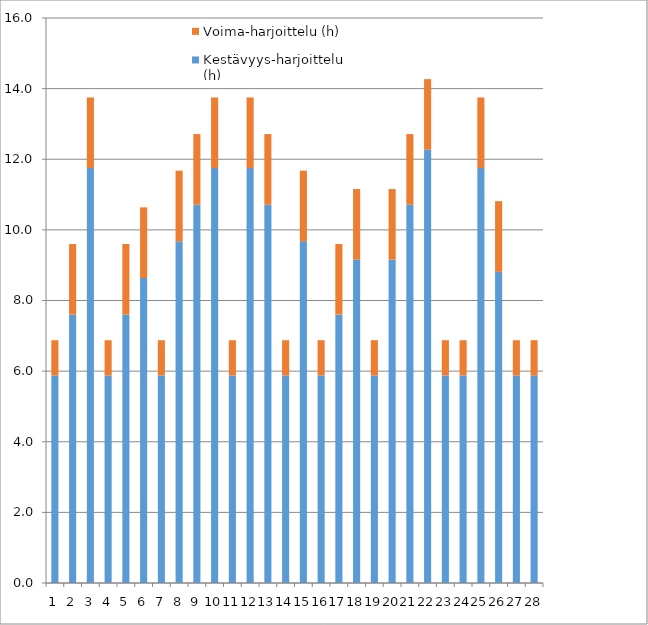
| Category | Kestävyys-harjoittelu (h) | Voima-harjoittelu (h) |
|---|---|---|
| 0 | 5.875 | 1 |
| 1 | 7.6 | 2 |
| 2 | 11.75 | 2 |
| 3 | 5.875 | 1 |
| 4 | 7.6 | 2 |
| 5 | 8.638 | 2 |
| 6 | 5.875 | 1 |
| 7 | 9.675 | 2 |
| 8 | 10.712 | 2 |
| 9 | 11.75 | 2 |
| 10 | 5.875 | 1 |
| 11 | 11.75 | 2 |
| 12 | 10.712 | 2 |
| 13 | 5.875 | 1 |
| 14 | 9.675 | 2 |
| 15 | 5.875 | 1 |
| 16 | 7.6 | 2 |
| 17 | 9.156 | 2 |
| 18 | 5.875 | 1 |
| 19 | 9.156 | 2 |
| 20 | 10.712 | 2 |
| 21 | 12.269 | 2 |
| 22 | 5.875 | 1 |
| 23 | 5.875 | 1 |
| 24 | 11.75 | 2 |
| 25 | 8.812 | 2 |
| 26 | 5.875 | 1 |
| 27 | 5.875 | 1 |